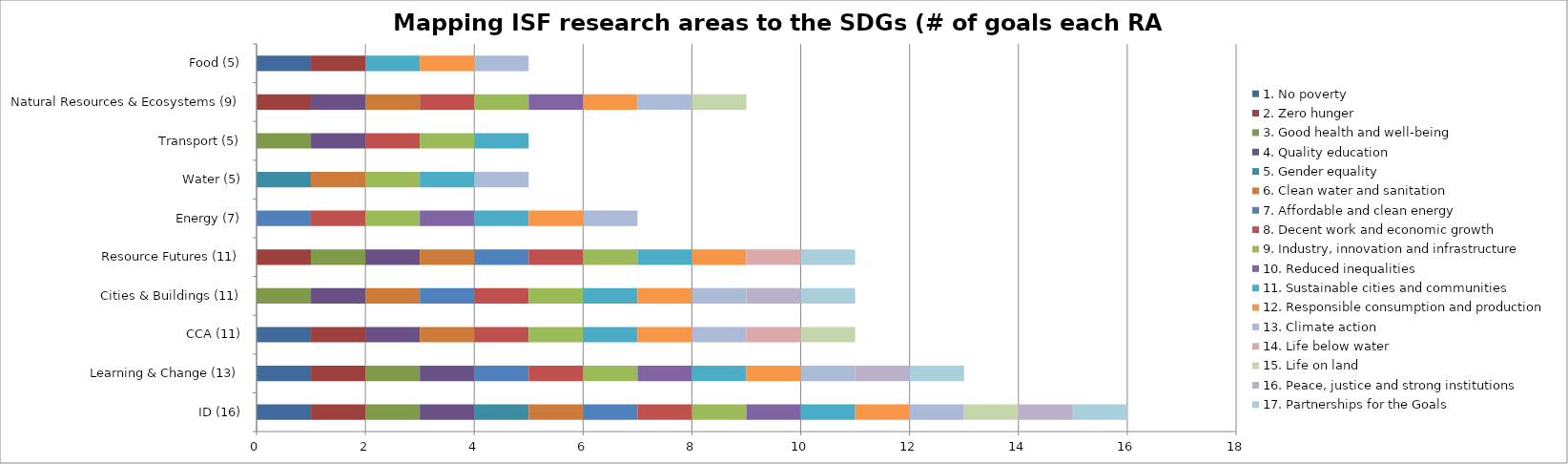
| Category | 1. No poverty | 2. Zero hunger | 3. Good health and well-being | 4. Quality education | 5. Gender equality | 6. Clean water and sanitation | 7. Affordable and clean energy | 8. Decent work and economic growth | 9. Industry, innovation and infrastructure | 10. Reduced inequalities | 11. Sustainable cities and communities | 12. Responsible consumption and production | 13. Climate action | 14. Life below water | 15. Life on land | 16. Peace, justice and strong institutions | 17. Partnerships for the Goals |
|---|---|---|---|---|---|---|---|---|---|---|---|---|---|---|---|---|---|
| ID (16) | 1 | 1 | 1 | 1 | 1 | 1 | 1 | 1 | 1 | 1 | 1 | 1 | 1 | 0 | 1 | 1 | 1 |
| Learning & Change (13) | 1 | 1 | 1 | 1 | 0 | 0 | 1 | 1 | 1 | 1 | 1 | 1 | 1 | 0 | 0 | 1 | 1 |
| CCA (11) | 1 | 1 | 0 | 1 | 0 | 1 | 0 | 1 | 1 | 0 | 1 | 1 | 1 | 1 | 1 | 0 | 0 |
| Cities & Buildings (11) | 0 | 0 | 1 | 1 | 0 | 1 | 1 | 1 | 1 | 0 | 1 | 1 | 1 | 0 | 0 | 1 | 1 |
| Resource Futures (11) | 0 | 1 | 1 | 1 | 0 | 1 | 1 | 1 | 1 | 0 | 1 | 1 | 0 | 1 | 0 | 0 | 1 |
| Energy (7) | 0 | 0 | 0 | 0 | 0 | 0 | 1 | 1 | 1 | 1 | 1 | 1 | 1 | 0 | 0 | 0 | 0 |
| Water (5) | 0 | 0 | 0 | 0 | 1 | 1 | 0 | 0 | 1 | 0 | 1 | 0 | 1 | 0 | 0 | 0 | 0 |
| Transport (5) | 0 | 0 | 1 | 1 | 0 | 0 | 0 | 1 | 1 | 0 | 1 | 0 | 0 | 0 | 0 | 0 | 0 |
| Natural Resources & Ecosystems (9) | 0 | 1 | 0 | 1 | 0 | 1 | 0 | 1 | 1 | 1 | 0 | 1 | 1 | 0 | 1 | 0 | 0 |
| Food (5) | 1 | 1 | 0 | 0 | 0 | 0 | 0 | 0 | 0 | 0 | 1 | 1 | 1 | 0 | 0 | 0 | 0 |